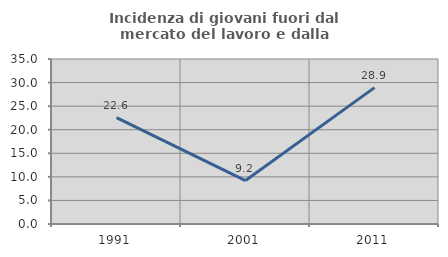
| Category | Incidenza di giovani fuori dal mercato del lavoro e dalla formazione  |
|---|---|
| 1991.0 | 22.581 |
| 2001.0 | 9.211 |
| 2011.0 | 28.926 |